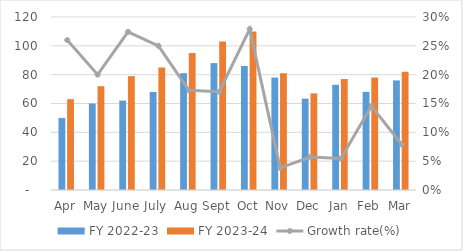
| Category | FY 2022-23 | FY 2023-24 |
|---|---|---|
| Apr | 50 | 63 |
| May | 60 | 72 |
| June | 62 | 79 |
| July | 68 | 85 |
| Aug | 81 | 95 |
| Sept | 88 | 103 |
| Oct | 86 | 110 |
| Nov | 78 | 81 |
| Dec | 63.37 | 67 |
| Jan | 73 | 77 |
| Feb | 68.092 | 78 |
| Mar | 76 | 82 |